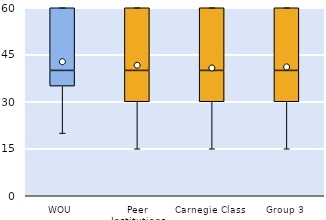
| Category | 25th | 50th | 75th |
|---|---|---|---|
| WOU | 35 | 5 | 20 |
| Peer Institutions | 30 | 10 | 20 |
| Carnegie Class | 30 | 10 | 20 |
| Group 3 | 30 | 10 | 20 |